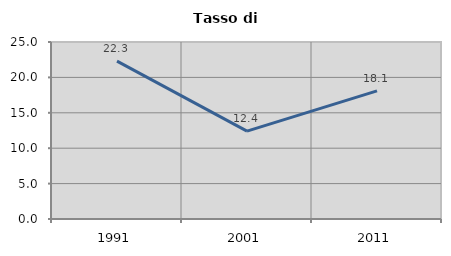
| Category | Tasso di disoccupazione   |
|---|---|
| 1991.0 | 22.304 |
| 2001.0 | 12.407 |
| 2011.0 | 18.094 |